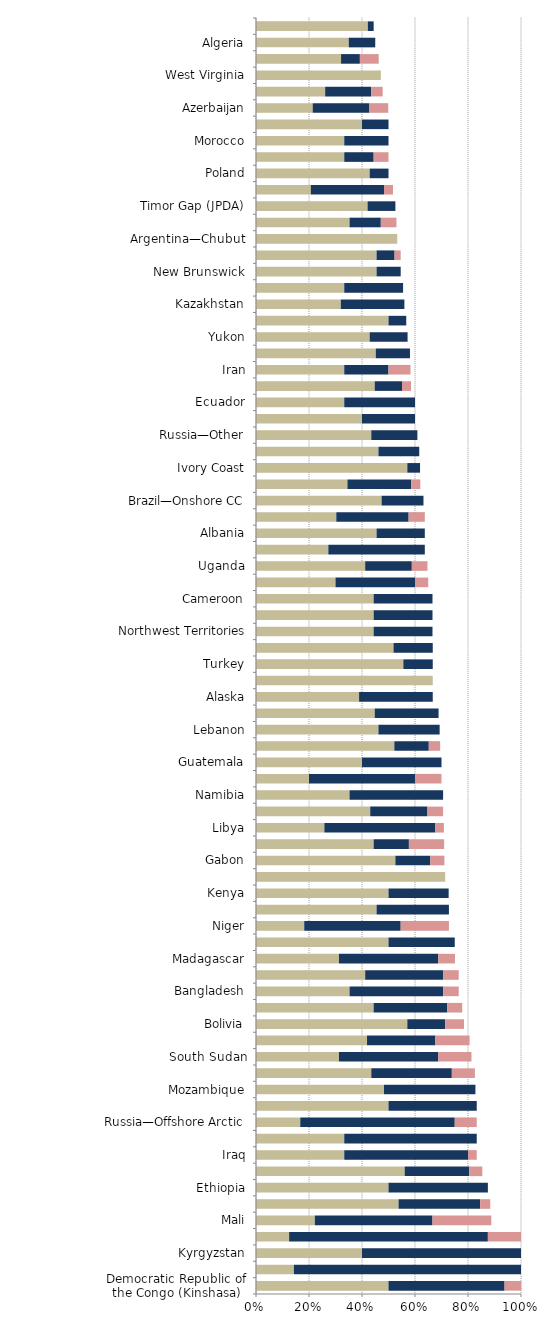
| Category |   Mild deterrent to investment |   Strong deterrent to investment |   Would not pursue investment due to this factor |
|---|---|---|---|
| Democratic Republic of the Congo (Kinshasa) | 0.5 | 0.438 | 0.063 |
| Greenland | 0.143 | 0.857 | 0 |
| Kyrgyzstan | 0.4 | 0.6 | 0 |
| Somaliland | 0.125 | 0.75 | 0.125 |
| Mali | 0.222 | 0.444 | 0.222 |
| Papua New Guinea | 0.538 | 0.308 | 0.038 |
| Ethiopia | 0.5 | 0.375 | 0 |
| Myanmar | 0.561 | 0.244 | 0.049 |
| Iraq | 0.333 | 0.467 | 0.033 |
| Russia—Eastern Siberia | 0.333 | 0.5 | 0 |
| Russia—Offshore Arctic | 0.167 | 0.583 | 0.083 |
| Uzbekistan | 0.5 | 0.333 | 0 |
| Mozambique | 0.483 | 0.345 | 0 |
| Tanzania | 0.435 | 0.304 | 0.087 |
| South Sudan | 0.313 | 0.375 | 0.125 |
| Venezuela | 0.419 | 0.258 | 0.129 |
| Bolivia | 0.571 | 0.143 | 0.071 |
| Cambodia | 0.444 | 0.278 | 0.056 |
| Bangladesh | 0.353 | 0.353 | 0.059 |
| Chad | 0.412 | 0.294 | 0.059 |
| Madagascar | 0.313 | 0.375 | 0.063 |
| Mauritania | 0.5 | 0.25 | 0 |
| Niger | 0.182 | 0.364 | 0.182 |
| Guyana | 0.455 | 0.273 | 0 |
| Kenya | 0.5 | 0.227 | 0 |
| Greece | 0.714 | 0 | 0 |
| Gabon | 0.526 | 0.132 | 0.053 |
| Nigeria | 0.444 | 0.133 | 0.133 |
| Libya | 0.258 | 0.419 | 0.032 |
| Indonesia | 0.431 | 0.216 | 0.059 |
| Namibia | 0.353 | 0.353 | 0 |
| Turkmenistan | 0.2 | 0.4 | 0.1 |
| Guatemala | 0.4 | 0.3 | 0 |
| Equatorial Guinea | 0.522 | 0.13 | 0.043 |
| Lebanon | 0.462 | 0.231 | 0 |
| Angola | 0.448 | 0.241 | 0 |
| Alaska | 0.389 | 0.278 | 0 |
| Georgia | 0.667 | 0 | 0 |
| Turkey | 0.556 | 0.111 | 0 |
| Brazil—Offshore presalt area PSC | 0.519 | 0.148 | 0 |
| Northwest Territories | 0.444 | 0.222 | 0 |
| Russia—Offshore Sakhalin | 0.444 | 0.222 | 0 |
| Cameroon | 0.444 | 0.222 | 0 |
| Yemen | 0.3 | 0.3 | 0.05 |
| Uganda | 0.412 | 0.176 | 0.059 |
| Quebec | 0.273 | 0.364 | 0 |
| Albania | 0.455 | 0.182 | 0 |
| India | 0.303 | 0.273 | 0.061 |
| Brazil—Onshore CC | 0.474 | 0.158 | 0 |
| Egypt | 0.345 | 0.241 | 0.034 |
| Ivory Coast | 0.571 | 0.048 | 0 |
| Philippines | 0.462 | 0.154 | 0 |
| Russia—Other | 0.435 | 0.174 | 0 |
| Republic of the Congo (Brazzaville) | 0.4 | 0.2 | 0 |
| Ecuador | 0.333 | 0.267 | 0 |
| Mexico | 0.448 | 0.103 | 0.034 |
| Iran | 0.333 | 0.167 | 0.083 |
| Ghana | 0.452 | 0.129 | 0 |
| Yukon | 0.429 | 0.143 | 0 |
| Brazil—Offshore CC | 0.5 | 0.067 | 0 |
| Kazakhstan | 0.32 | 0.24 | 0 |
| Cyprus | 0.333 | 0.222 | 0 |
| New Brunswick | 0.455 | 0.091 | 0 |
| Colombia | 0.455 | 0.068 | 0.023 |
| Argentina—Chubut | 0.533 | 0 | 0 |
| Pakistan | 0.353 | 0.118 | 0.059 |
| Timor Gap (JPDA) | 0.421 | 0.105 | 0 |
| Peru | 0.207 | 0.276 | 0.034 |
| Poland | 0.429 | 0.071 | 0 |
| South Africa | 0.333 | 0.111 | 0.056 |
| Morocco | 0.333 | 0.167 | 0 |
| Suriname | 0.4 | 0.1 | 0 |
| Azerbaijan | 0.214 | 0.214 | 0.071 |
| Tunisia | 0.261 | 0.174 | 0.043 |
| West Virginia | 0.471 | 0 | 0 |
| China | 0.321 | 0.071 | 0.071 |
| Algeria | 0.35 | 0.1 | 0 |
| Vietnam | 0.422 | 0.022 | 0 |